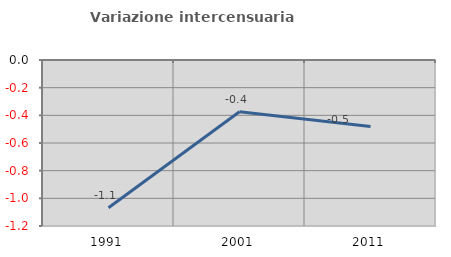
| Category | Variazione intercensuaria annua |
|---|---|
| 1991.0 | -1.068 |
| 2001.0 | -0.375 |
| 2011.0 | -0.481 |